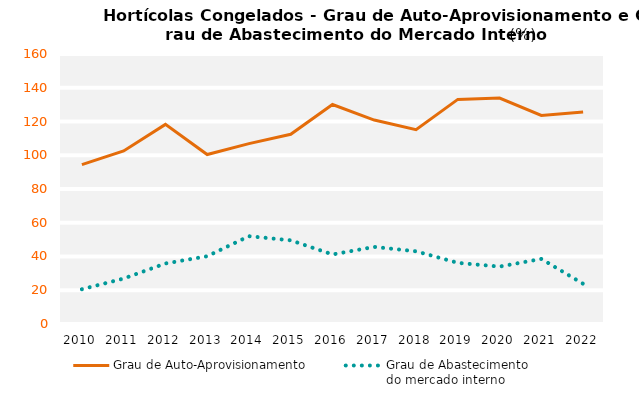
| Category | Grau de Auto-Aprovisionamento | Grau de Abastecimento
do mercado interno |
|---|---|---|
| 2010.0 | 94.44 | 20.591 |
| 2011.0 | 102.571 | 26.935 |
| 2012.0 | 118.304 | 35.861 |
| 2013.0 | 100.439 | 40.158 |
| 2014.0 | 106.882 | 52.03 |
| 2015.0 | 112.433 | 49.592 |
| 2016.0 | 130.061 | 41.215 |
| 2017.0 | 120.869 | 45.692 |
| 2018.0 | 115.147 | 43.079 |
| 2019.0 | 133.101 | 36.228 |
| 2020.0 | 133.903 | 34.016 |
| 2021.0 | 123.608 | 38.565 |
| 2022.0 | 125.609 | 23.832 |